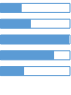
| Category | Исполнение, % | План |
|---|---|---|
| 0 | 0.3 | 1 |
| 1 | 0.433 | 1 |
| 2 | 1.25 | 1 |
| 3 | 0.769 | 1 |
| 4 | 0.334 | 1 |